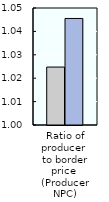
| Category | 2000-02 | 2018-20 |
|---|---|---|
| Ratio of producer 
to border price 
(Producer NPC) | 1.025 | 1.046 |